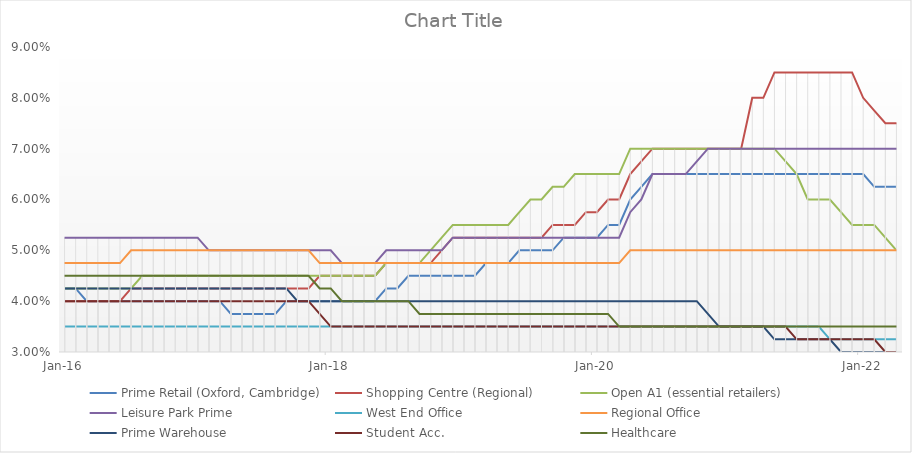
| Category | Prime Retail (Oxford, Cambridge)  | Shopping Centre (Regional) | Open A1 (essential retailers)  | Leisure Park Prime  | West End Office  | Regional Office | Prime Warehouse  | Student Acc.  | Healthcare |
|---|---|---|---|---|---|---|---|---|---|
| 2016-01-01 | 0.042 | 0.04 | 0.042 | 0.052 | 0.035 | 0.048 | 0.042 | 0.04 | 0.045 |
| 2016-02-29 | 0.042 | 0.04 | 0.042 | 0.052 | 0.035 | 0.048 | 0.042 | 0.04 | 0.045 |
| 2016-03-31 | 0.04 | 0.04 | 0.042 | 0.052 | 0.035 | 0.048 | 0.042 | 0.04 | 0.045 |
| 2016-04-30 | 0.04 | 0.04 | 0.042 | 0.052 | 0.035 | 0.048 | 0.042 | 0.04 | 0.045 |
| 2016-05-31 | 0.04 | 0.04 | 0.042 | 0.052 | 0.035 | 0.048 | 0.042 | 0.04 | 0.045 |
| 2016-06-30 | 0.04 | 0.04 | 0.042 | 0.052 | 0.035 | 0.048 | 0.042 | 0.04 | 0.045 |
| 2016-07-31 | 0.04 | 0.042 | 0.042 | 0.052 | 0.035 | 0.05 | 0.042 | 0.04 | 0.045 |
| 2016-08-31 | 0.04 | 0.042 | 0.045 | 0.052 | 0.035 | 0.05 | 0.042 | 0.04 | 0.045 |
| 2016-09-30 | 0.04 | 0.042 | 0.045 | 0.052 | 0.035 | 0.05 | 0.042 | 0.04 | 0.045 |
| 2016-10-31 | 0.04 | 0.042 | 0.045 | 0.052 | 0.035 | 0.05 | 0.042 | 0.04 | 0.045 |
| 2016-11-30 | 0.04 | 0.042 | 0.045 | 0.052 | 0.035 | 0.05 | 0.042 | 0.04 | 0.045 |
| 2016-12-31 | 0.04 | 0.042 | 0.045 | 0.052 | 0.035 | 0.05 | 0.042 | 0.04 | 0.045 |
| 2017-01-31 | 0.04 | 0.042 | 0.045 | 0.052 | 0.035 | 0.05 | 0.042 | 0.04 | 0.045 |
| 2017-02-28 | 0.04 | 0.042 | 0.045 | 0.05 | 0.035 | 0.05 | 0.042 | 0.04 | 0.045 |
| 2017-03-31 | 0.04 | 0.042 | 0.045 | 0.05 | 0.035 | 0.05 | 0.042 | 0.04 | 0.045 |
| 2017-04-30 | 0.038 | 0.042 | 0.045 | 0.05 | 0.035 | 0.05 | 0.042 | 0.04 | 0.045 |
| 2017-05-31 | 0.038 | 0.042 | 0.045 | 0.05 | 0.035 | 0.05 | 0.042 | 0.04 | 0.045 |
| 2017-06-30 | 0.038 | 0.042 | 0.045 | 0.05 | 0.035 | 0.05 | 0.042 | 0.04 | 0.045 |
| 2017-07-31 | 0.038 | 0.042 | 0.045 | 0.05 | 0.035 | 0.05 | 0.042 | 0.04 | 0.045 |
| 2017-08-31 | 0.038 | 0.042 | 0.045 | 0.05 | 0.035 | 0.05 | 0.042 | 0.04 | 0.045 |
| 2017-09-30 | 0.04 | 0.042 | 0.045 | 0.05 | 0.035 | 0.05 | 0.042 | 0.04 | 0.045 |
| 2017-10-31 | 0.04 | 0.042 | 0.045 | 0.05 | 0.035 | 0.05 | 0.04 | 0.04 | 0.045 |
| 2017-11-30 | 0.04 | 0.042 | 0.045 | 0.05 | 0.035 | 0.05 | 0.04 | 0.04 | 0.045 |
| 2017-12-31 | 0.04 | 0.045 | 0.045 | 0.05 | 0.035 | 0.048 | 0.04 | 0.038 | 0.042 |
| 2018-01-31 | 0.04 | 0.045 | 0.045 | 0.05 | 0.035 | 0.048 | 0.04 | 0.035 | 0.042 |
| 2018-02-28 | 0.04 | 0.045 | 0.045 | 0.048 | 0.035 | 0.048 | 0.04 | 0.035 | 0.04 |
| 2018-03-31 | 0.04 | 0.045 | 0.045 | 0.048 | 0.035 | 0.048 | 0.04 | 0.035 | 0.04 |
| 2018-04-30 | 0.04 | 0.045 | 0.045 | 0.048 | 0.035 | 0.048 | 0.04 | 0.035 | 0.04 |
| 2018-05-31 | 0.04 | 0.045 | 0.045 | 0.048 | 0.035 | 0.048 | 0.04 | 0.035 | 0.04 |
| 2018-06-30 | 0.042 | 0.048 | 0.048 | 0.05 | 0.035 | 0.048 | 0.04 | 0.035 | 0.04 |
| 2018-07-31 | 0.042 | 0.048 | 0.048 | 0.05 | 0.035 | 0.048 | 0.04 | 0.035 | 0.04 |
| 2018-08-31 | 0.045 | 0.048 | 0.048 | 0.05 | 0.035 | 0.048 | 0.04 | 0.035 | 0.04 |
| 2018-09-30 | 0.045 | 0.048 | 0.048 | 0.05 | 0.035 | 0.048 | 0.04 | 0.035 | 0.038 |
| 2018-10-31 | 0.045 | 0.048 | 0.05 | 0.05 | 0.035 | 0.048 | 0.04 | 0.035 | 0.038 |
| 2018-11-30 | 0.045 | 0.05 | 0.052 | 0.05 | 0.035 | 0.048 | 0.04 | 0.035 | 0.038 |
| 2018-12-31 | 0.045 | 0.052 | 0.055 | 0.052 | 0.035 | 0.048 | 0.04 | 0.035 | 0.038 |
| 2019-01-31 | 0.045 | 0.052 | 0.055 | 0.052 | 0.035 | 0.048 | 0.04 | 0.035 | 0.038 |
| 2019-02-28 | 0.045 | 0.052 | 0.055 | 0.052 | 0.035 | 0.048 | 0.04 | 0.035 | 0.038 |
| 2019-03-31 | 0.048 | 0.052 | 0.055 | 0.052 | 0.035 | 0.048 | 0.04 | 0.035 | 0.038 |
| 2019-04-30 | 0.048 | 0.052 | 0.055 | 0.052 | 0.035 | 0.048 | 0.04 | 0.035 | 0.038 |
| 2019-05-31 | 0.048 | 0.052 | 0.055 | 0.052 | 0.035 | 0.048 | 0.04 | 0.035 | 0.038 |
| 2019-06-30 | 0.05 | 0.052 | 0.058 | 0.052 | 0.035 | 0.048 | 0.04 | 0.035 | 0.038 |
| 2019-07-31 | 0.05 | 0.052 | 0.06 | 0.052 | 0.035 | 0.048 | 0.04 | 0.035 | 0.038 |
| 2019-08-31 | 0.05 | 0.052 | 0.06 | 0.052 | 0.035 | 0.048 | 0.04 | 0.035 | 0.038 |
| 2019-09-30 | 0.05 | 0.055 | 0.062 | 0.052 | 0.035 | 0.048 | 0.04 | 0.035 | 0.038 |
| 2019-10-31 | 0.052 | 0.055 | 0.062 | 0.052 | 0.035 | 0.048 | 0.04 | 0.035 | 0.038 |
| 2019-11-30 | 0.052 | 0.055 | 0.065 | 0.052 | 0.035 | 0.048 | 0.04 | 0.035 | 0.038 |
| 2019-12-31 | 0.052 | 0.058 | 0.065 | 0.052 | 0.035 | 0.048 | 0.04 | 0.035 | 0.038 |
| 2020-01-31 | 0.052 | 0.058 | 0.065 | 0.052 | 0.035 | 0.048 | 0.04 | 0.035 | 0.038 |
| 2020-02-29 | 0.055 | 0.06 | 0.065 | 0.052 | 0.035 | 0.048 | 0.04 | 0.035 | 0.038 |
| 2020-03-31 | 0.055 | 0.06 | 0.065 | 0.052 | 0.035 | 0.048 | 0.04 | 0.035 | 0.035 |
| 2020-04-30 | 0.06 | 0.065 | 0.07 | 0.058 | 0.035 | 0.05 | 0.04 | 0.035 | 0.035 |
| 2020-05-31 | 0.062 | 0.068 | 0.07 | 0.06 | 0.035 | 0.05 | 0.04 | 0.035 | 0.035 |
| 2020-06-30 | 0.065 | 0.07 | 0.07 | 0.065 | 0.035 | 0.05 | 0.04 | 0.035 | 0.035 |
| 2020-07-31 | 0.065 | 0.07 | 0.07 | 0.065 | 0.035 | 0.05 | 0.04 | 0.035 | 0.035 |
| 2020-08-31 | 0.065 | 0.07 | 0.07 | 0.065 | 0.035 | 0.05 | 0.04 | 0.035 | 0.035 |
| 2020-09-30 | 0.065 | 0.07 | 0.07 | 0.065 | 0.035 | 0.05 | 0.04 | 0.035 | 0.035 |
| 2020-10-31 | 0.065 | 0.07 | 0.07 | 0.068 | 0.035 | 0.05 | 0.04 | 0.035 | 0.035 |
| 2020-11-30 | 0.065 | 0.07 | 0.07 | 0.07 | 0.035 | 0.05 | 0.038 | 0.035 | 0.035 |
| 2020-12-31 | 0.065 | 0.07 | 0.07 | 0.07 | 0.035 | 0.05 | 0.035 | 0.035 | 0.035 |
| 2021-01-31 | 0.065 | 0.07 | 0.07 | 0.07 | 0.035 | 0.05 | 0.035 | 0.035 | 0.035 |
| 2021-02-28 | 0.065 | 0.07 | 0.07 | 0.07 | 0.035 | 0.05 | 0.035 | 0.035 | 0.035 |
| 2021-03-31 | 0.065 | 0.08 | 0.07 | 0.07 | 0.035 | 0.05 | 0.035 | 0.035 | 0.035 |
| 2021-04-30 | 0.065 | 0.08 | 0.07 | 0.07 | 0.035 | 0.05 | 0.035 | 0.035 | 0.035 |
| 2021-05-31 | 0.065 | 0.085 | 0.07 | 0.07 | 0.035 | 0.05 | 0.032 | 0.035 | 0.035 |
| 2021-06-30 | 0.065 | 0.085 | 0.068 | 0.07 | 0.035 | 0.05 | 0.032 | 0.035 | 0.035 |
| 2021-07-31 | 0.065 | 0.085 | 0.065 | 0.07 | 0.035 | 0.05 | 0.032 | 0.032 | 0.035 |
| 2021-08-31 | 0.065 | 0.085 | 0.06 | 0.07 | 0.035 | 0.05 | 0.032 | 0.032 | 0.035 |
| 2021-09-30 | 0.065 | 0.085 | 0.06 | 0.07 | 0.035 | 0.05 | 0.032 | 0.032 | 0.035 |
| 2021-10-31 | 0.065 | 0.085 | 0.06 | 0.07 | 0.032 | 0.05 | 0.032 | 0.032 | 0.035 |
| 2021-11-30 | 0.065 | 0.085 | 0.058 | 0.07 | 0.032 | 0.05 | 0.03 | 0.032 | 0.035 |
| 2021-12-31 | 0.065 | 0.085 | 0.055 | 0.07 | 0.032 | 0.05 | 0.03 | 0.032 | 0.035 |
| 2022-01-31 | 0.065 | 0.08 | 0.055 | 0.07 | 0.032 | 0.05 | 0.03 | 0.032 | 0.035 |
| 2022-02-28 | 0.062 | 0.078 | 0.055 | 0.07 | 0.032 | 0.05 | 0.03 | 0.032 | 0.035 |
| 2022-03-31 | 0.062 | 0.075 | 0.052 | 0.07 | 0.032 | 0.05 | 0.03 | 0.03 | 0.035 |
| 2022-04-30 | 0.062 | 0.075 | 0.05 | 0.07 | 0.032 | 0.05 | 0.03 | 0.03 | 0.035 |